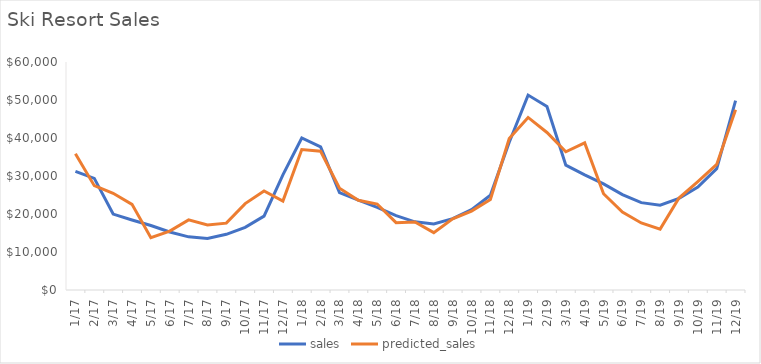
| Category | sales | predicted_sales |
|---|---|---|
| 2017-01-01 | 31206 | 35864.694 |
| 2017-02-01 | 29381 | 27461.163 |
| 2017-03-01 | 19982 | 25458.085 |
| 2017-04-01 | 18430 | 22530.235 |
| 2017-05-01 | 16980 | 13771.327 |
| 2017-06-01 | 15267 | 15511.055 |
| 2017-07-01 | 13989 | 18450.911 |
| 2017-08-01 | 13569 | 17138.989 |
| 2017-09-01 | 14661 | 17590.362 |
| 2017-10-01 | 16484 | 22732.11 |
| 2017-11-01 | 19437 | 26045.225 |
| 2017-12-01 | 30316 | 23415.984 |
| 2018-01-01 | 40008 | 36971.643 |
| 2018-02-01 | 37668 | 36524.307 |
| 2018-03-01 | 25618 | 26772.586 |
| 2018-04-01 | 23628 | 23617.417 |
| 2018-05-01 | 21769 | 22617.034 |
| 2018-06-01 | 19573 | 17715.069 |
| 2018-07-01 | 17935 | 17877.67 |
| 2018-08-01 | 17396 | 15102.994 |
| 2018-09-01 | 18796 | 18746.728 |
| 2018-10-01 | 21133 | 20775.182 |
| 2018-11-01 | 24919 | 23841.211 |
| 2018-12-01 | 38867 | 39852.198 |
| 2019-01-01 | 51292 | 45410.993 |
| 2019-02-01 | 48292 | 41458.508 |
| 2019-03-01 | 32844 | 36385.62 |
| 2019-04-01 | 30292 | 38709.772 |
| 2019-05-01 | 27909 | 25319.745 |
| 2019-06-01 | 25094 | 20496.176 |
| 2019-07-01 | 22993 | 17634.95 |
| 2019-08-01 | 22303 | 16022.157 |
| 2019-09-01 | 24098 | 24192.563 |
| 2019-10-01 | 27093 | 28541.69 |
| 2019-11-01 | 31948 | 33034.545 |
| 2019-12-01 | 49829 | 47408.103 |